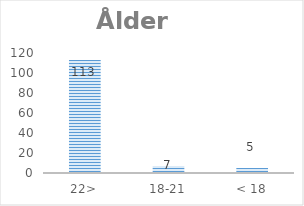
| Category | Series 0 |
|---|---|
| 22> | 113 |
| 18-21 | 7 |
| < 18 | 5 |